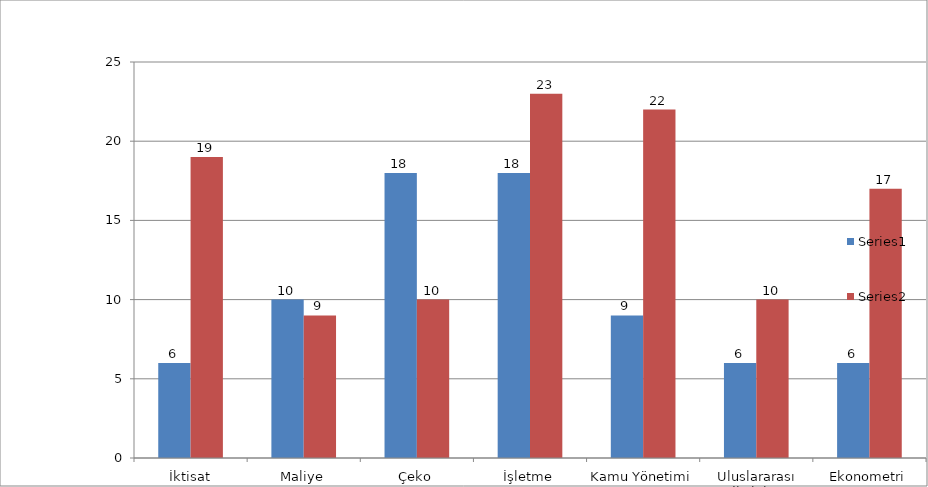
| Category | Series 0 | Series 1 |
|---|---|---|
| İktisat | 6 | 19 |
| Maliye | 10 | 9 |
| Çeko | 18 | 10 |
| İşletme | 18 | 23 |
| Kamu Yönetimi | 9 | 22 |
| Uluslararası İlişkiler | 6 | 10 |
| Ekonometri | 6 | 17 |